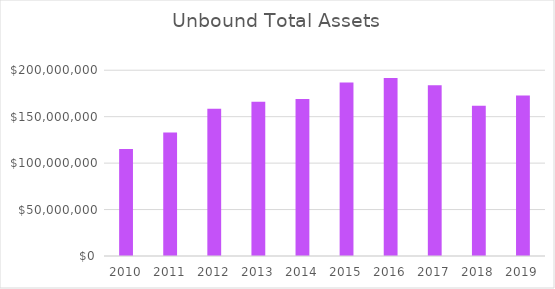
| Category | Total Assets |
|---|---|
| 2010.0 | 115090018 |
| 2011.0 | 132881356 |
| 2012.0 | 158488470 |
| 2013.0 | 166080781 |
| 2014.0 | 168967952 |
| 2015.0 | 186714492 |
| 2016.0 | 191548585 |
| 2017.0 | 183832143 |
| 2018.0 | 161731631 |
| 2019.0 | 172772797 |